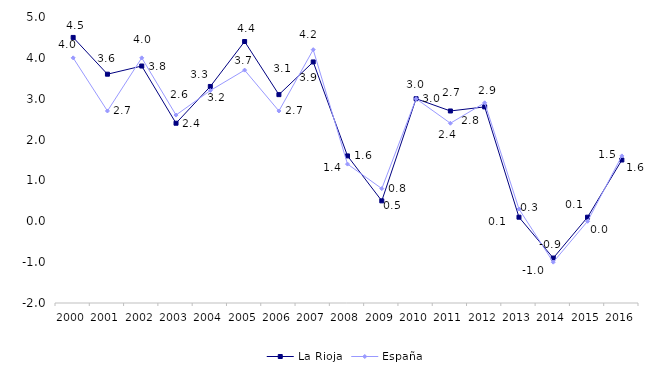
| Category | La Rioja | España |
|---|---|---|
| 2000.0 | 4.5 | 4 |
| 2001.0 | 3.6 | 2.7 |
| 2002.0 | 3.8 | 4 |
| 2003.0 | 2.4 | 2.6 |
| 2004.0 | 3.3 | 3.2 |
| 2005.0 | 4.4 | 3.7 |
| 2006.0 | 3.1 | 2.7 |
| 2007.0 | 3.9 | 4.2 |
| 2008.0 | 1.6 | 1.4 |
| 2009.0 | 0.5 | 0.8 |
| 2010.0 | 3 | 3 |
| 2011.0 | 2.7 | 2.4 |
| 2012.0 | 2.8 | 2.9 |
| 2013.0 | 0.1 | 0.3 |
| 2014.0 | -0.9 | -1 |
| 2015.0 | 0.1 | 0 |
| 2016.0 | 1.5 | 1.6 |